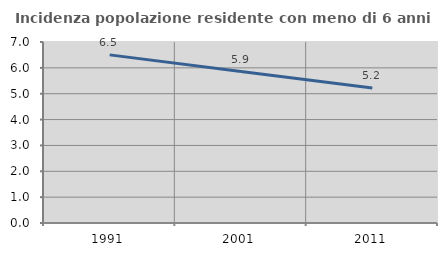
| Category | Incidenza popolazione residente con meno di 6 anni |
|---|---|
| 1991.0 | 6.502 |
| 2001.0 | 5.857 |
| 2011.0 | 5.224 |